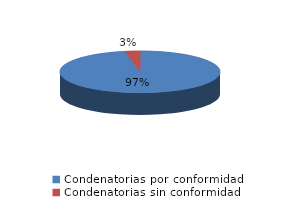
| Category | Series 0 |
|---|---|
| 0 | 2116 |
| 1 | 67 |